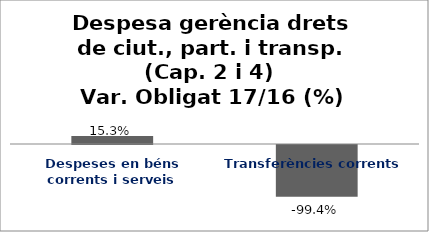
| Category | Series 0 |
|---|---|
| Despeses en béns corrents i serveis | 0.153 |
| Transferències corrents | -0.994 |